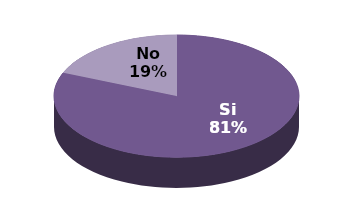
| Category | Series 1 | Series 0 |
|---|---|---|
| Si | 13 | 81.3 |
| No | 3 | 18.8 |